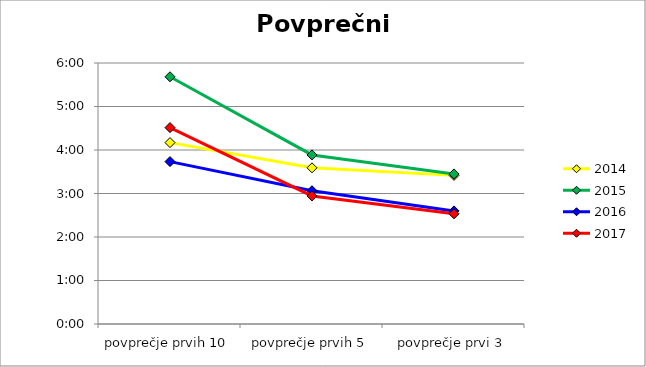
| Category | 2014 | 2015 | 2016 | 2017 |
|---|---|---|---|---|
| povprečje prvih 10 | 0.174 | 0.237 | 0.156 | 0.188 |
| povprečje prvih 5 | 0.15 | 0.162 | 0.128 | 0.123 |
| povprečje prvi 3 | 0.142 | 0.144 | 0.108 | 0.106 |